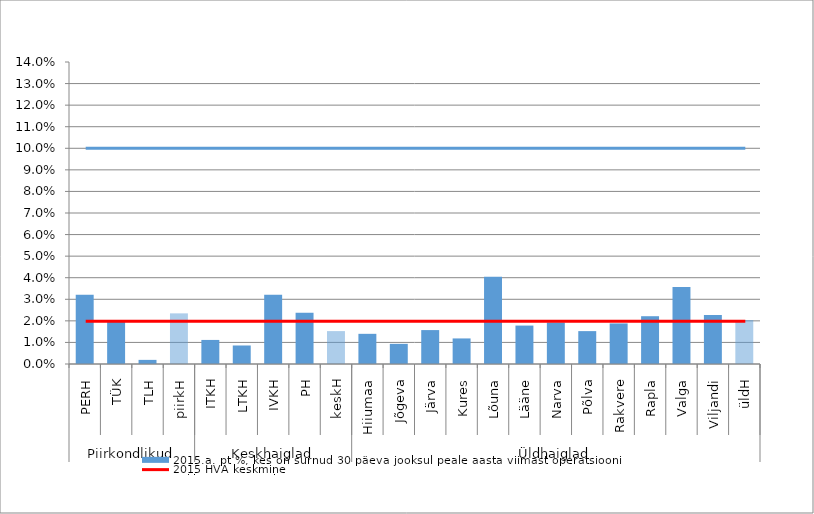
| Category | 2015.a. pt %, kes on surnud 30 päeva jooksul peale aasta viimast operatsiooni |
|---|---|
| 0 | 0.032 |
| 1 | 0.02 |
| 2 | 0.002 |
| 3 | 0.023 |
| 4 | 0.011 |
| 5 | 0.009 |
| 6 | 0.032 |
| 7 | 0.024 |
| 8 | 0.015 |
| 9 | 0.014 |
| 10 | 0.009 |
| 11 | 0.016 |
| 12 | 0.012 |
| 13 | 0.04 |
| 14 | 0.018 |
| 15 | 0.019 |
| 16 | 0.015 |
| 17 | 0.019 |
| 18 | 0.022 |
| 19 | 0.036 |
| 20 | 0.023 |
| 21 | 0.02 |